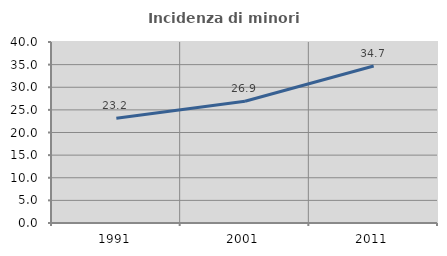
| Category | Incidenza di minori stranieri |
|---|---|
| 1991.0 | 23.171 |
| 2001.0 | 26.891 |
| 2011.0 | 34.701 |